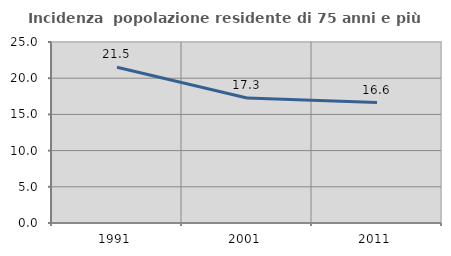
| Category | Incidenza  popolazione residente di 75 anni e più |
|---|---|
| 1991.0 | 21.503 |
| 2001.0 | 17.274 |
| 2011.0 | 16.635 |